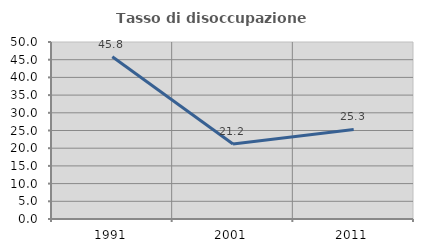
| Category | Tasso di disoccupazione giovanile  |
|---|---|
| 1991.0 | 45.833 |
| 2001.0 | 21.176 |
| 2011.0 | 25.301 |